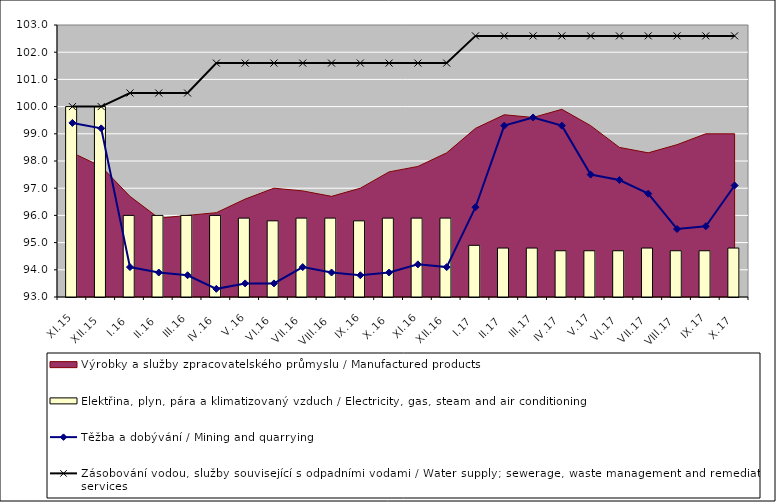
| Category | Elektřina, plyn, pára a klimatizovaný vzduch / Electricity, gas, steam and air conditioning |
|---|---|
| XI.15 | 100 |
| XII.15 | 100 |
| I.16 | 96 |
| II.16 | 96 |
| III.16 | 96 |
| IV.16 | 96 |
| V.16 | 95.9 |
| VI.16 | 95.8 |
| VII.16 | 95.9 |
| VIII.16 | 95.9 |
| IX.16 | 95.8 |
| X.16 | 95.9 |
| XI.16 | 95.9 |
| XII.16 | 95.9 |
| I.17 | 94.9 |
| II.17 | 94.8 |
| III.17 | 94.8 |
| IV.17 | 94.7 |
| V.17 | 94.7 |
| VI.17 | 94.7 |
| VII.17 | 94.8 |
| VIII.17 | 94.7 |
| IX.17 | 94.7 |
| X.17 | 94.8 |